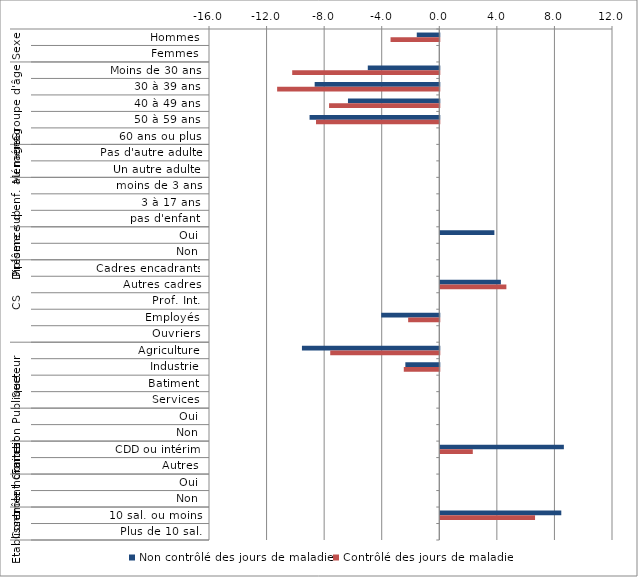
| Category | Non contrôlé des jours de maladie | Contrôlé des jours de maladie |
|---|---|---|
| 0 | -1.564 | -3.386 |
| 1 | 0 | 0 |
| 2 | -4.967 | -10.219 |
| 3 | -8.658 | -11.266 |
| 4 | -6.345 | -7.658 |
| 5 | -9.013 | -8.565 |
| 6 | 0 | 0 |
| 7 | 0 | 0 |
| 8 | 0 | 0 |
| 9 | 0 | 0 |
| 10 | 0 | 0 |
| 11 | 0 | 0 |
| 12 | 3.758 | 0 |
| 13 | 0 | 0 |
| 14 | 0 | 0 |
| 15 | 4.209 | 4.592 |
| 16 | 0 | 0 |
| 17 | -4.034 | -2.163 |
| 18 | 0 | 0 |
| 19 | -9.543 | -7.577 |
| 20 | -2.358 | -2.466 |
| 21 | 0 | 0 |
| 22 | 0 | 0 |
| 23 | 0 | 0 |
| 24 | 0 | 0 |
| 25 | 8.587 | 2.259 |
| 26 | 0 | 0 |
| 27 | 0 | 0 |
| 28 | 0 | 0 |
| 29 | 8.408 | 6.584 |
| 30 | 0 | 0 |